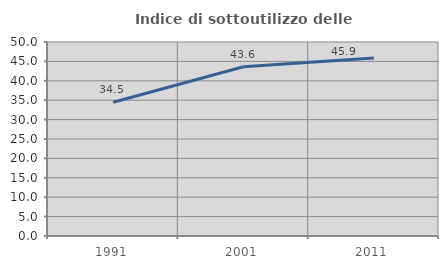
| Category | Indice di sottoutilizzo delle abitazioni  |
|---|---|
| 1991.0 | 34.457 |
| 2001.0 | 43.617 |
| 2011.0 | 45.874 |